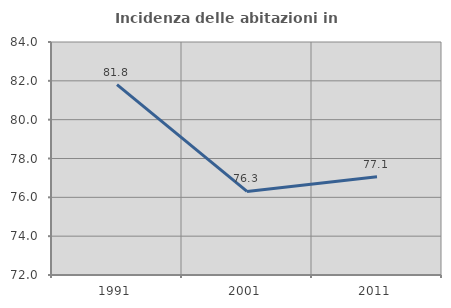
| Category | Incidenza delle abitazioni in proprietà  |
|---|---|
| 1991.0 | 81.8 |
| 2001.0 | 76.303 |
| 2011.0 | 77.057 |